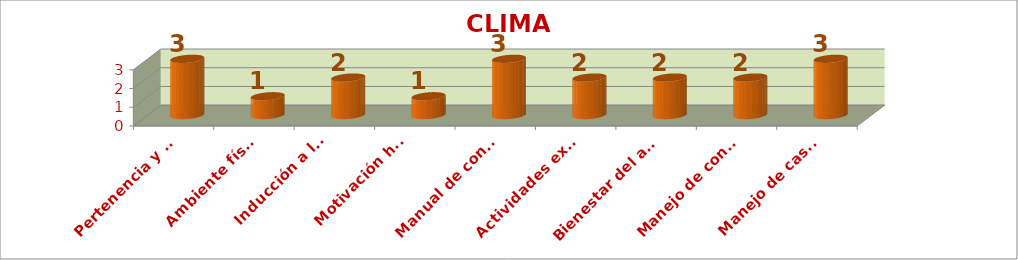
| Category | CLIMA ESCOLAR |
|---|---|
| Pertenencia y participación | 3 |
| Ambiente físico | 1 |
| Inducción a los nuevos
estudiantes | 2 |
| Motivación hacia el
aprendizaje | 1 |
| Manual de convivencia | 3 |
| Actividades extracurriculares | 2 |
| Bienestar del alumnado | 2 |
| Manejo de conflictos | 2 |
| Manejo de casos difíciles | 3 |